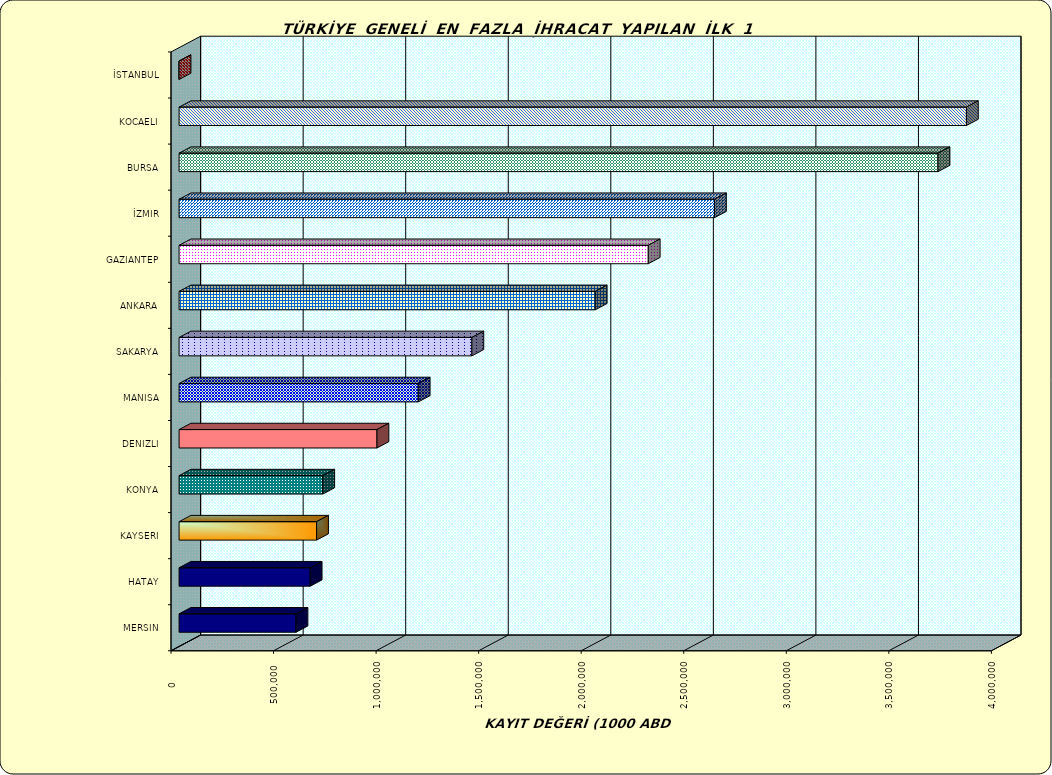
| Category | Series 0 |
|---|---|
| İSTANBUL | 5.094 |
| KOCAELI | 3838878.697 |
| BURSA | 3700473.783 |
| İZMIR | 2610569.568 |
| GAZIANTEP | 2287656.245 |
| ANKARA | 2029212.696 |
| SAKARYA | 1427605.444 |
| MANISA | 1166074.387 |
| DENIZLI | 964879.958 |
| KONYA | 700570.585 |
| KAYSERI | 670438.859 |
| HATAY | 639269.931 |
| MERSIN | 570102.764 |